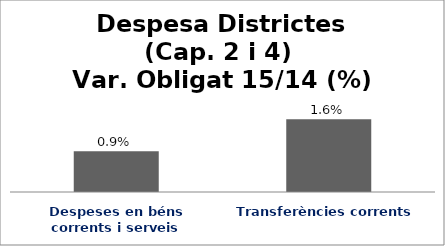
| Category | Series 0 |
|---|---|
| Despeses en béns corrents i serveis | 0.009 |
| Transferències corrents | 0.016 |